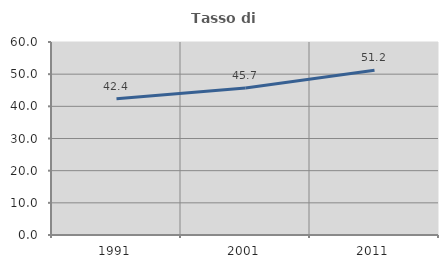
| Category | Tasso di occupazione   |
|---|---|
| 1991.0 | 42.364 |
| 2001.0 | 45.673 |
| 2011.0 | 51.198 |